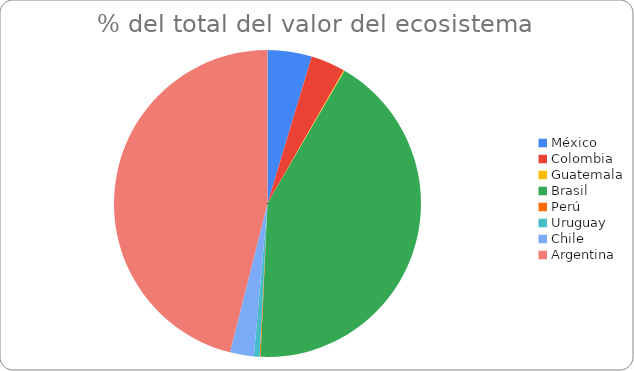
| Category | Número de startups, capital recaudado y valor del ecosistema por país (2021) |
|---|---|
| México | 0.047 |
| Colombia | 0.036 |
| Guatemala | 0.001 |
| Brasil | 0.423 |
| Perú | 0.001 |
| Uruguay | 0.006 |
| Chile | 0.025 |
| Argentina | 0.461 |